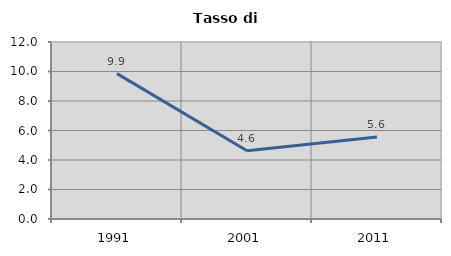
| Category | Tasso di disoccupazione   |
|---|---|
| 1991.0 | 9.854 |
| 2001.0 | 4.627 |
| 2011.0 | 5.565 |